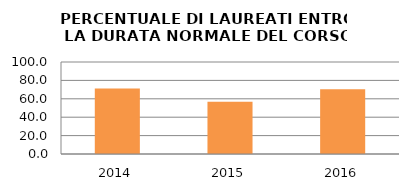
| Category | 2014 2015 2016 |
|---|---|
| 2014.0 | 71.154 |
| 2015.0 | 56.667 |
| 2016.0 | 70.37 |